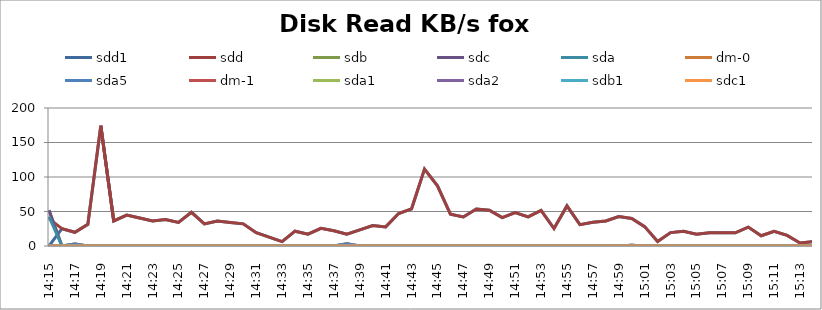
| Category | sdd1 | sdd | sdb | sdc | sda | dm-0 | sda5 | dm-1 | sda1 | sda2 | sdb1 | sdc1 |
|---|---|---|---|---|---|---|---|---|---|---|---|---|
| 14:15 | 0 | 39.6 | 51.8 | 51.8 | 42.7 | 0 | 0 | 0 | 0 | 0 | 0 | 0 |
| 14:16 | 25.1 | 25.1 | 0 | 0 | 0 | 0 | 0 | 0 | 0 | 0 | 0 | 0 |
| 14:17 | 19.9 | 19.9 | 0 | 0 | 2.9 | 2.9 | 2.9 | 0 | 0 | 0 | 0 | 0 |
| 14:18 | 31.3 | 31.3 | 0 | 0 | 0 | 0 | 0 | 0 | 0 | 0 | 0 | 0 |
| 14:19 | 174.3 | 174.3 | 0 | 0 | 0 | 0 | 0 | 0 | 0 | 0 | 0 | 0 |
| 14:20 | 36.3 | 36.3 | 0 | 0 | 0 | 0 | 0 | 0 | 0 | 0 | 0 | 0 |
| 14:21 | 44.7 | 44.7 | 0 | 0 | 0.1 | 0.1 | 0.1 | 0 | 0 | 0 | 0 | 0 |
| 14:22 | 40.5 | 40.5 | 0 | 0 | 0 | 0 | 0 | 0 | 0 | 0 | 0 | 0 |
| 14:23 | 36.3 | 36.3 | 0 | 0 | 0 | 0 | 0 | 0 | 0 | 0 | 0 | 0 |
| 14:24 | 38.5 | 38.5 | 0 | 0 | 0 | 0 | 0 | 0 | 0 | 0 | 0 | 0 |
| 14:25 | 34.2 | 34.2 | 0 | 0 | 0 | 0 | 0 | 0 | 0 | 0 | 0 | 0 |
| 14:26 | 48.9 | 48.9 | 0 | 0 | 0 | 0 | 0 | 0 | 0 | 0 | 0 | 0 |
| 14:27 | 32.1 | 32.1 | 0 | 0 | 0 | 0 | 0 | 0 | 0 | 0 | 0 | 0 |
| 14:28 | 36.3 | 36.3 | 0 | 0 | 0 | 0 | 0 | 0 | 0 | 0 | 0 | 0 |
| 14:29 | 34.1 | 34.1 | 0 | 0 | 0 | 0 | 0 | 0 | 0 | 0 | 0 | 0 |
| 14:30 | 32.1 | 32.1 | 0 | 0 | 0 | 0 | 0 | 0 | 0 | 0 | 0 | 0 |
| 14:31 | 19.3 | 19.3 | 0 | 0 | 0 | 0 | 0 | 0 | 0 | 0 | 0 | 0 |
| 14:32 | 12.8 | 12.8 | 0 | 0 | 0 | 0 | 0 | 0 | 0 | 0 | 0 | 0 |
| 14:33 | 6.4 | 6.4 | 0 | 0 | 0 | 0 | 0 | 0 | 0 | 0 | 0 | 0 |
| 14:34 | 21.5 | 21.5 | 0 | 0 | 0 | 0 | 0 | 0 | 0 | 0 | 0 | 0 |
| 14:35 | 17.1 | 17.1 | 0 | 0 | 0 | 0 | 0 | 0 | 0 | 0 | 0 | 0 |
| 14:36 | 25.7 | 25.7 | 0 | 0 | 0 | 0 | 0 | 0 | 0 | 0 | 0 | 0 |
| 14:37 | 22.1 | 22.1 | 0 | 0 | 0 | 0 | 0 | 0 | 0 | 0 | 0 | 0 |
| 14:38 | 17.1 | 17.1 | 0 | 0 | 3.2 | 3.1 | 3.2 | 0.1 | 0 | 0 | 0 | 0 |
| 14:39 | 23.4 | 23.4 | 0 | 0 | 0.2 | 0.2 | 0.2 | 0 | 0 | 0 | 0 | 0 |
| 14:40 | 29.7 | 29.7 | 0 | 0 | 0 | 0 | 0 | 0 | 0 | 0 | 0 | 0 |
| 14:41 | 27.7 | 27.7 | 0 | 0 | 0 | 0 | 0 | 0 | 0 | 0 | 0 | 0 |
| 14:42 | 47.1 | 47.1 | 0 | 0 | 0 | 0 | 0 | 0 | 0 | 0 | 0 | 0 |
| 14:43 | 53.9 | 53.9 | 0 | 0 | 0 | 0 | 0 | 0 | 0 | 0 | 0 | 0 |
| 14:44 | 111.5 | 111.5 | 0 | 0 | 0 | 0 | 0 | 0 | 0 | 0 | 0 | 0 |
| 14:45 | 87.3 | 87.3 | 0 | 0 | 0 | 0 | 0 | 0 | 0 | 0 | 0 | 0 |
| 14:46 | 46.1 | 46.1 | 0 | 0 | 0 | 0 | 0 | 0 | 0 | 0 | 0 | 0 |
| 14:47 | 42.1 | 42.1 | 0 | 0 | 0 | 0 | 0 | 0 | 0 | 0 | 0 | 0 |
| 14:48 | 53.5 | 53.5 | 0 | 0 | 0 | 0 | 0 | 0 | 0 | 0 | 0 | 0 |
| 14:49 | 51.9 | 51.9 | 0 | 0 | 0 | 0 | 0 | 0 | 0 | 0 | 0 | 0 |
| 14:50 | 41.2 | 41.2 | 0 | 0 | 0 | 0 | 0 | 0 | 0 | 0 | 0 | 0 |
| 14:51 | 48.3 | 48.3 | 0 | 0 | 0 | 0 | 0 | 0 | 0 | 0 | 0 | 0 |
| 14:52 | 42.2 | 42.2 | 0 | 0 | 0 | 0 | 0 | 0 | 0 | 0 | 0 | 0 |
| 14:53 | 51.6 | 51.6 | 0 | 0 | 0.1 | 0.1 | 0.1 | 0 | 0 | 0 | 0 | 0 |
| 14:54 | 25.3 | 25.3 | 0 | 0 | 0 | 0 | 0 | 0 | 0 | 0 | 0 | 0 |
| 14:55 | 58.1 | 58.1 | 0 | 0 | 0 | 0 | 0 | 0 | 0 | 0 | 0 | 0 |
| 14:56 | 30.9 | 30.9 | 0 | 0 | 0 | 0 | 0 | 0 | 0 | 0 | 0 | 0 |
| 14:57 | 34.3 | 34.3 | 0 | 0 | 0 | 0 | 0 | 0 | 0 | 0 | 0 | 0 |
| 14:58 | 36.3 | 36.3 | 0 | 0 | 0 | 0 | 0 | 0 | 0 | 0 | 0 | 0 |
| 14:59 | 42.6 | 42.6 | 0 | 0 | 0 | 0 | 0 | 0 | 0 | 0 | 0 | 0 |
| 15:00 | 39.8 | 39.8 | 0 | 0 | 1.1 | 0 | 1.1 | 1.1 | 0 | 0 | 0 | 0 |
| 15:01 | 28.1 | 28.1 | 0 | 0 | 0 | 0 | 0 | 0 | 0 | 0 | 0 | 0 |
| 15:02 | 6.5 | 6.5 | 0 | 0 | 0 | 0 | 0 | 0 | 0 | 0 | 0 | 0 |
| 15:03 | 19.4 | 19.4 | 0 | 0 | 0 | 0 | 0 | 0 | 0 | 0 | 0 | 0 |
| 15:04 | 21.5 | 21.5 | 0 | 0 | 0 | 0 | 0 | 0 | 0 | 0 | 0 | 0 |
| 15:05 | 17.1 | 17.1 | 0 | 0 | 0 | 0 | 0 | 0 | 0 | 0 | 0 | 0 |
| 15:06 | 19.3 | 19.3 | 0 | 0 | 0 | 0 | 0 | 0 | 0 | 0 | 0 | 0 |
| 15:07 | 19.3 | 19.3 | 0 | 0 | 0 | 0 | 0 | 0 | 0 | 0 | 0 | 0 |
| 15:08 | 19.2 | 19.2 | 0 | 0 | 0 | 0 | 0 | 0 | 0 | 0 | 0 | 0 |
| 15:09 | 27.4 | 27.4 | 0 | 0 | 0 | 0 | 0 | 0 | 0 | 0 | 0 | 0 |
| 15:10 | 14.9 | 14.9 | 0 | 0 | 0 | 0 | 0 | 0 | 0 | 0 | 0 | 0 |
| 15:11 | 21.4 | 21.4 | 0 | 0 | 0 | 0 | 0 | 0 | 0 | 0 | 0 | 0 |
| 15:12 | 15.3 | 15.3 | 0 | 0 | 0 | 0 | 0 | 0 | 0 | 0 | 0 | 0 |
| 15:13 | 4.3 | 4.3 | 0 | 0 | 0 | 0 | 0 | 0 | 0 | 0 | 0 | 0 |
| 15:14 | 6.4 | 6.4 | 0 | 0 | 0 | 0 | 0 | 0 | 0 | 0 | 0 | 0 |